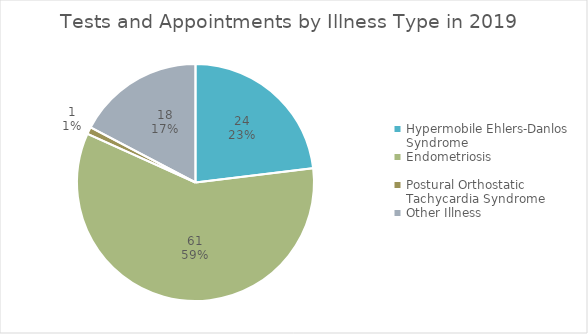
| Category | Total |
|---|---|
| Hypermobile Ehlers-Danlos Syndrome | 24 |
| Endometriosis | 61 |
| Postural Orthostatic Tachycardia Syndrome | 1 |
| Other Illness | 18 |